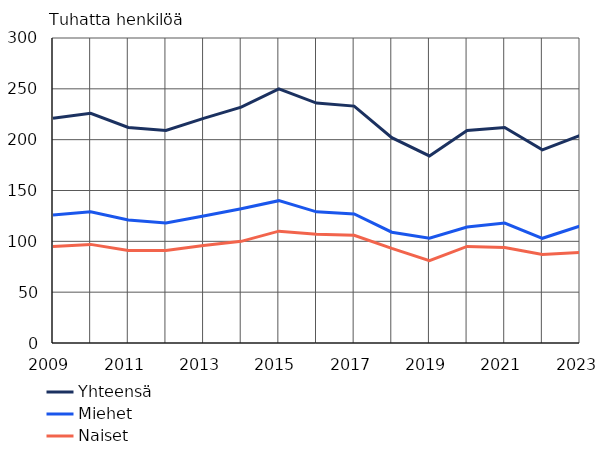
| Category | Yhteensä | Miehet | Naiset |
|---|---|---|---|
| 2009 | 221 | 126 | 95 |
| 2010 | 226 | 129 | 97 |
| 2011 | 212 | 121 | 91 |
| 2012 | 209 | 118 | 91 |
| 2013 | 221 | 125 | 96 |
| 2014 | 232 | 132 | 100 |
| 2015 | 250 | 140 | 110 |
| 2016 | 236 | 129 | 107 |
| 2017 | 233 | 127 | 106 |
| 2018 | 202 | 109 | 93 |
| 2019 | 184 | 103 | 81 |
| 2020 | 209 | 114 | 95 |
| 2021 | 212 | 118 | 94 |
| 2022 | 190 | 103 | 87 |
| 2023 | 204 | 115 | 89 |